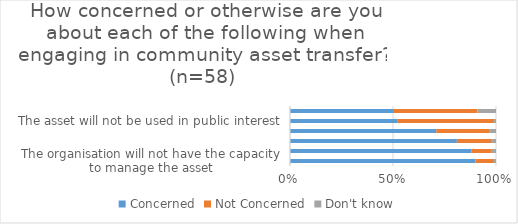
| Category | Concerned | Not Concerned | Don't know |
|---|---|---|---|
| The organisation will not have the capacity to manage the asset | 0.9 | 0.09 | 0.02 |
| The community group will not be able to access the finances needed to manage the asset sustainably | 0.88 | 0.1 | 0.02 |
| If the project fails the asset will be returned to the council in a worse condition | 0.81 | 0.17 | 0.02 |
| The community group will not be able to access the finances needed to purchase the asset | 0.71 | 0.26 | 0.03 |
| The asset will not be used in public interest | 0.52 | 0.47 | 0.02 |
| That the ability of public bodies to support a particular project is limited by State Aid rules | 0.5 | 0.41 | 0.09 |